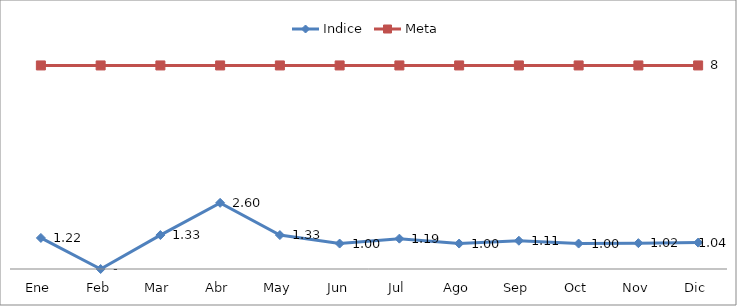
| Category | Indice | Meta |
|---|---|---|
| Ene | 1.221 | 8 |
| Feb | 0 | 8 |
| Mar | 1.333 | 8 |
| Abr | 2.6 | 8 |
| May | 1.333 | 8 |
| Jun | 1 | 8 |
| Jul | 1.194 | 8 |
| Ago | 1 | 8 |
| Sep | 1.111 | 8 |
| Oct | 1 | 8 |
| Nov | 1.016 | 8 |
| Dic | 1.038 | 8 |